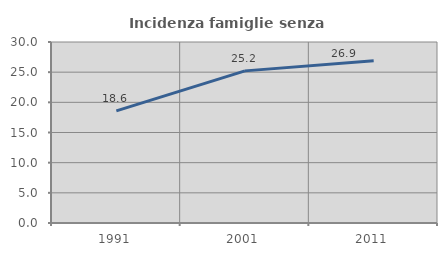
| Category | Incidenza famiglie senza nuclei |
|---|---|
| 1991.0 | 18.584 |
| 2001.0 | 25.214 |
| 2011.0 | 26.901 |